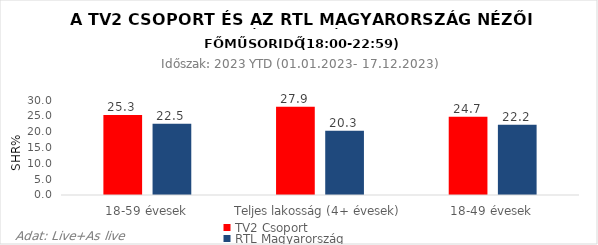
| Category | TV2 Csoport | RTL Magyarország |
|---|---|---|
| 18-59 évesek | 25.3 | 22.5 |
| Teljes lakosság (4+ évesek) | 27.9 | 20.3 |
| 18-49 évesek | 24.7 | 22.2 |